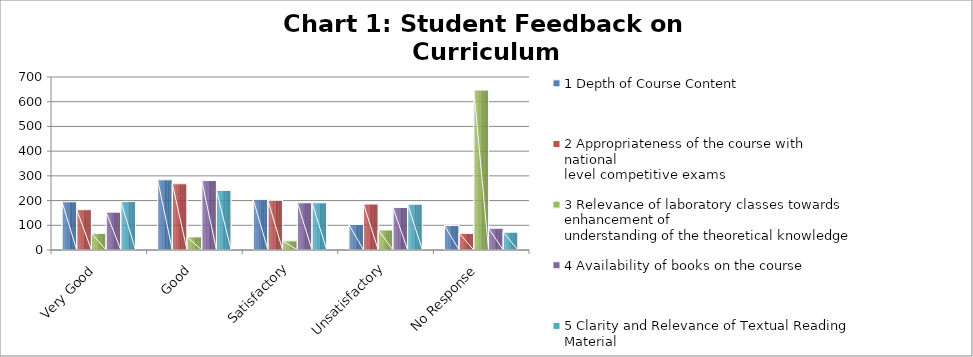
| Category | 1 Depth of Course Content | 2 Appropriateness of the course with national 
level competitive exams | 3 Relevance of laboratory classes towards enhancement of
understanding of the theoretical knowledge | 4 Availability of books on the course | 5 Clarity and Relevance of Textual Reading Material |
|---|---|---|---|---|---|
| Very Good | 195 | 163 | 67 | 153 | 196 |
| Good | 284 | 268 | 53 | 281 | 241 |
| Satisfactory | 204 | 201 | 37 | 191 | 191 |
| Unsatisfactory | 103 | 186 | 81 | 172 | 185 |
| No Response | 99 | 67 | 647 | 88 | 72 |